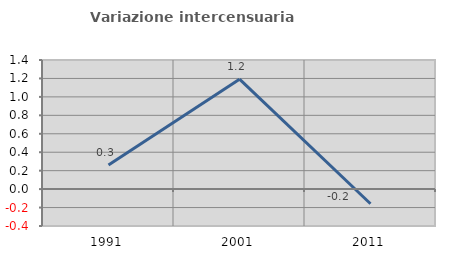
| Category | Variazione intercensuaria annua |
|---|---|
| 1991.0 | 0.261 |
| 2001.0 | 1.192 |
| 2011.0 | -0.158 |